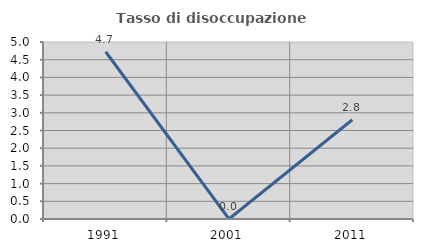
| Category | Tasso di disoccupazione giovanile  |
|---|---|
| 1991.0 | 4.724 |
| 2001.0 | 0 |
| 2011.0 | 2.804 |